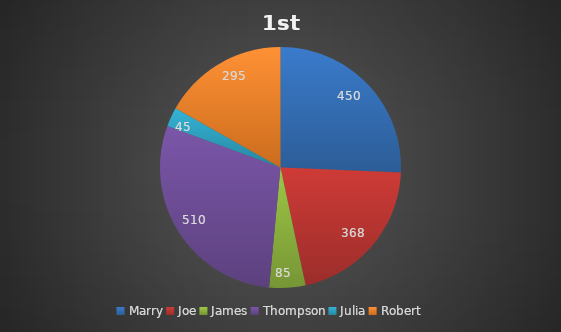
| Category | 1st Quarter |
|---|---|
| Marry | 450 |
| Joe | 368 |
| James | 85 |
| Thompson | 510 |
| Julia | 45 |
| Robert | 295 |